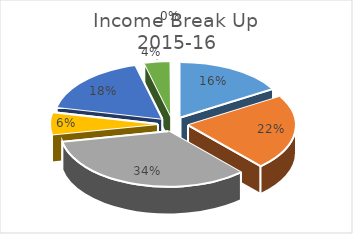
| Category | Income Break Up 
2015-16 |
|---|---|
| FCO Grant | 0.164 |
| Teaching | 0.219 |
| Examination | 0.337 |
| Partnership | 0.065 |
| Contracts | 0.176 |
| Other Paid Services | 0.039 |
| Bank Interest | 0.001 |